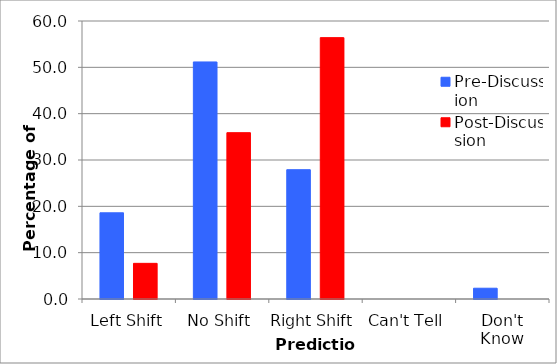
| Category | Pre-Discussion | Post-Discussion |
|---|---|---|
| Left Shift | 18.605 | 7.692 |
| No Shift | 51.163 | 35.897 |
| Right Shift | 27.907 | 56.41 |
| Can't Tell | 0 | 0 |
| Don't Know | 2.326 | 0 |